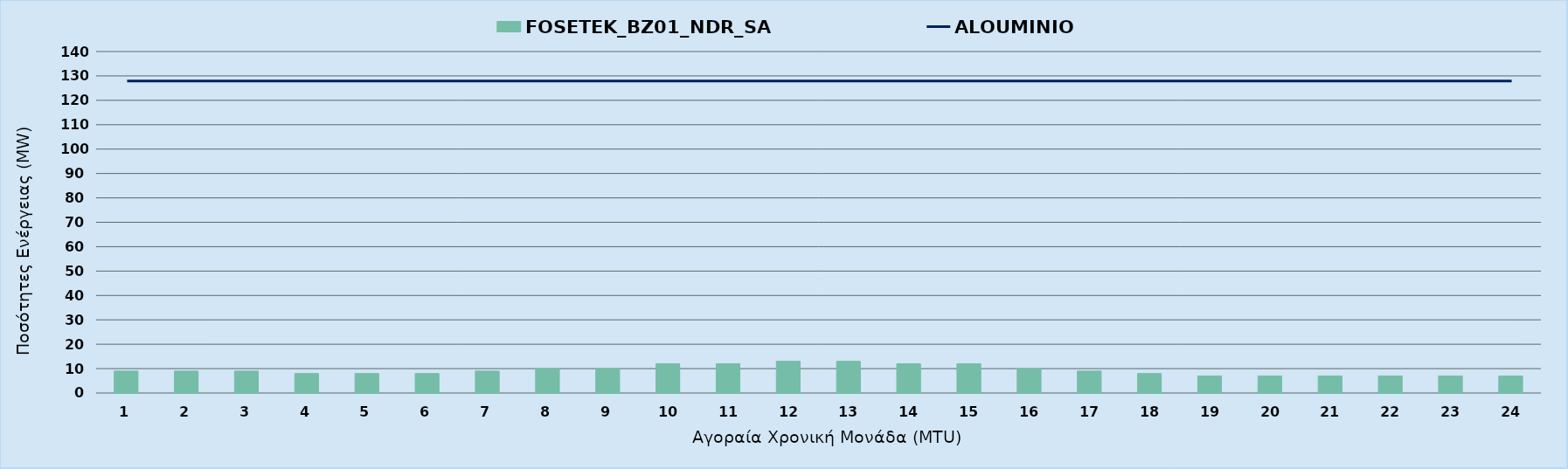
| Category | FOSETEK_BZ01_NDR_SA |
|---|---|
| 0 | 9 |
| 1 | 9 |
| 2 | 9 |
| 3 | 8 |
| 4 | 8 |
| 5 | 8 |
| 6 | 9 |
| 7 | 10 |
| 8 | 10 |
| 9 | 12 |
| 10 | 12 |
| 11 | 13 |
| 12 | 13 |
| 13 | 12 |
| 14 | 12 |
| 15 | 10 |
| 16 | 9 |
| 17 | 8 |
| 18 | 7 |
| 19 | 7 |
| 20 | 7 |
| 21 | 7 |
| 22 | 7 |
| 23 | 7 |